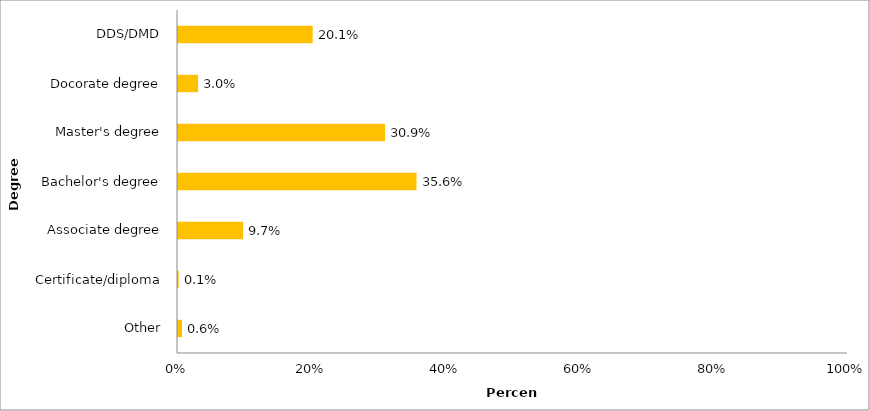
| Category | 2015-16 |
|---|---|
| Other | 0.006 |
| Certificate/diploma | 0.001 |
| Associate degree | 0.097 |
| Bachelor's degree | 0.356 |
| Master's degree | 0.309 |
| Docorate degree | 0.03 |
| DDS/DMD | 0.201 |